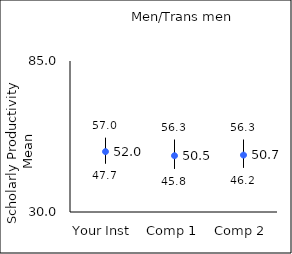
| Category | 25th percentile | 75th percentile | Mean |
|---|---|---|---|
| Your Inst | 47.7 | 57 | 51.99 |
| Comp 1 | 45.8 | 56.3 | 50.49 |
| Comp 2 | 46.2 | 56.3 | 50.73 |